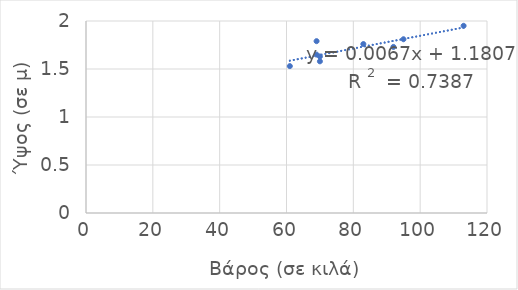
| Category | Ύψος (σε μ) |
|---|---|
| 95.0 | 1.81 |
| 83.0 | 1.76 |
| 61.0 | 1.53 |
| 92.0 | 1.73 |
| 69.0 | 1.65 |
| 70.0 | 1.58 |
| 113.0 | 1.95 |
| 69.0 | 1.79 |
| 70.0 | 1.63 |